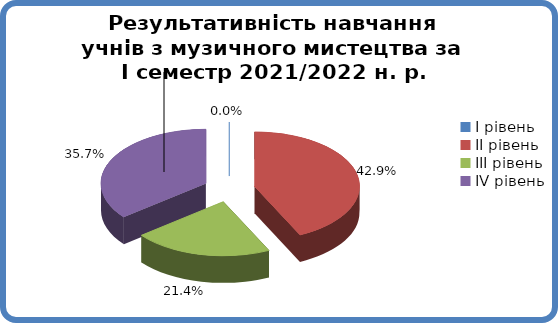
| Category | Series 0 |
|---|---|
| 0 | 0 |
| 1 | 0.429 |
| 2 | 0.214 |
| 3 | 0.357 |